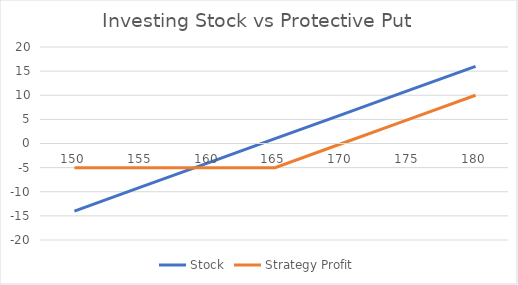
| Category | Stock | Strategy Profit |
|---|---|---|
| 150.0 | -14 | -5 |
| 155.0 | -9 | -5 |
| 160.0 | -4 | -5 |
| 165.0 | 1 | -5 |
| 170.0 | 6 | 0 |
| 175.0 | 11 | 5 |
| 180.0 | 16 | 10 |